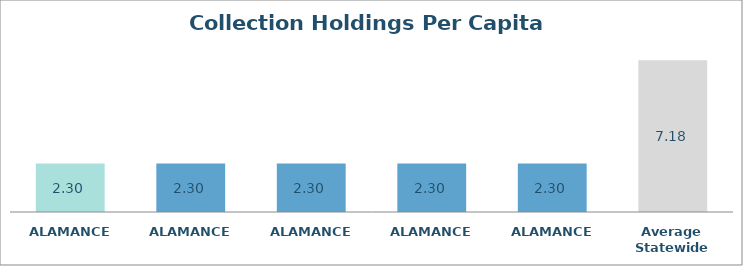
| Category | Series 0 |
|---|---|
| ALAMANCE  | 2.301 |
| ALAMANCE  | 2.301 |
| ALAMANCE  | 2.301 |
| ALAMANCE  | 2.301 |
| ALAMANCE  | 2.301 |
| Average Statewide | 7.183 |